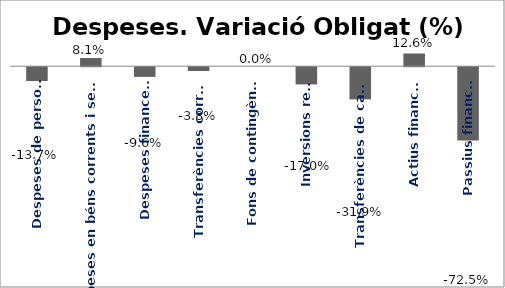
| Category | Series 0 |
|---|---|
| Despeses de personal | -0.137 |
| Despeses en béns corrents i serveis | 0.081 |
| Despeses financeres | -0.096 |
| Transferències corrents | -0.038 |
| Fons de contingència | 0 |
| Inversions reals | -0.17 |
| Transferències de capital | -0.319 |
| Actius financers | 0.126 |
| Passius financers | -0.725 |